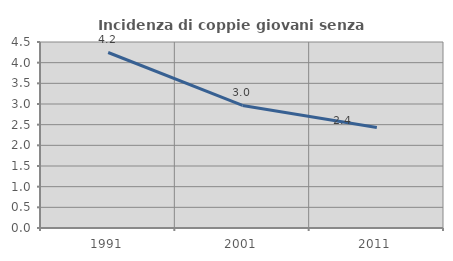
| Category | Incidenza di coppie giovani senza figli |
|---|---|
| 1991.0 | 4.246 |
| 2001.0 | 2.965 |
| 2011.0 | 2.432 |